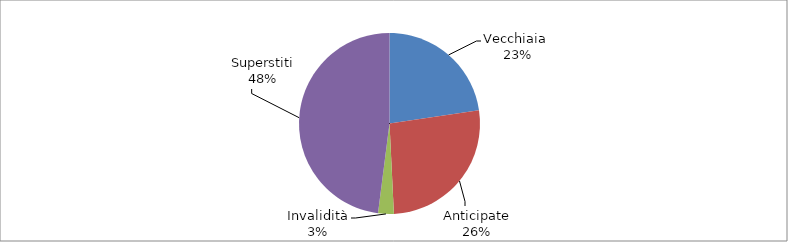
| Category | Series 0 |
|---|---|
| Vecchiaia  | 8113 |
| Anticipate | 9526 |
| Invalidità | 1006 |
| Superstiti | 17190 |